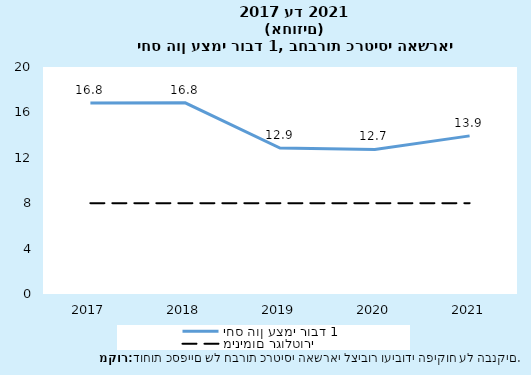
| Category | יחס הון עצמי רובד 1 | מינימום רגולטורי |
|---|---|---|
| 2017-12-31 | 16.828 | 8 |
| 2018-12-31 | 16.848 | 8 |
| 2019-12-31 | 12.861 | 8 |
| 2020-12-31 | 12.736 | 8 |
| 2021-12-31 | 13.931 | 8 |